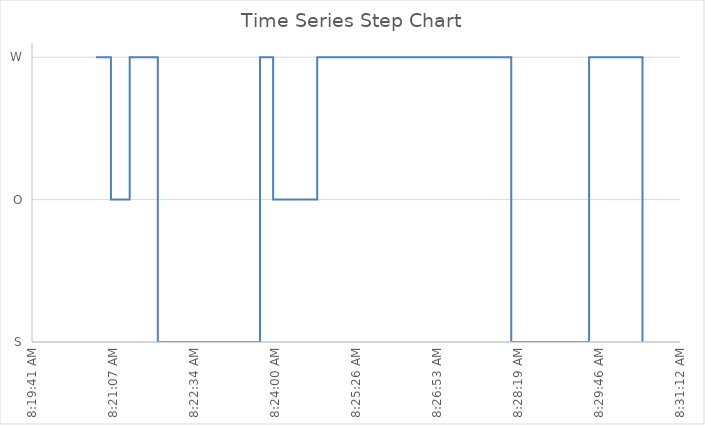
| Category | Step Chart Data |
|---|---|
| 0.34778935185185184 | 2 |
| 0.34797453703703707 | 2 |
| 0.34797453703703707 | 1 |
| 0.3482060185185185 | 1 |
| 0.3482060185185185 | 2 |
| 0.34855324074074073 | 2 |
| 0.34855324074074073 | 0 |
| 0.3498148148148148 | 0 |
| 0.3498148148148148 | 2 |
| 0.34997685185185184 | 2 |
| 0.34997685185185184 | 1 |
| 0.35052083333333334 | 1 |
| 0.35052083333333334 | 2 |
| 0.3529166666666667 | 2 |
| 0.3529166666666667 | 0 |
| 0.3538773148148148 | 0 |
| 0.3538773148148148 | 2 |
| 0.35453703703703704 | 2 |
| 0.35453703703703704 | 0 |